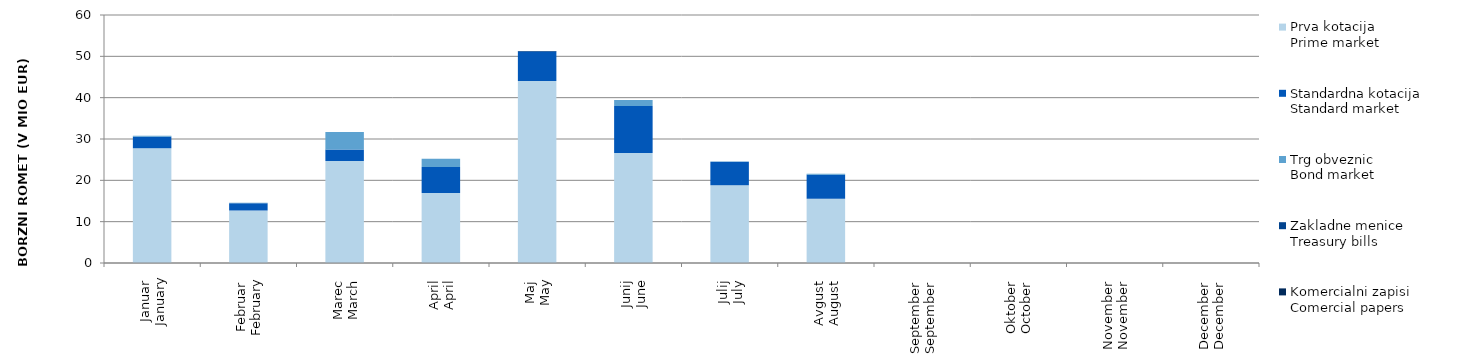
| Category | Prva kotacija
Prime market | Standardna kotacija
Standard market | Trg obveznic
Bond market | Zakladne menice
Treasury bills | Komercialni zapisi
Comercial papers |
|---|---|---|---|---|---|
| Januar
January | 27.745 | 2.796 | 0.249 | 0 | 0 |
| Februar
February | 12.685 | 1.784 | 0.118 | 0 | 0 |
| Marec
March | 24.676 | 2.813 | 4.174 | 0 | 0 |
| April
April | 16.942 | 6.272 | 2.01 | 0 | 0 |
| Maj
May | 44.02 | 7.1 | 0 | 0.145 | 0 |
| Junij
June | 26.612 | 11.39 | 1.425 | 0 | 0 |
| Julij
July | 18.826 | 5.646 | 0.075 | 0 | 0 |
| Avgust
August | 15.523 | 5.813 | 0.265 | 0 | 0 |
| September
September | 0 | 0 | 0 | 0 | 0 |
| Oktober
October | 0 | 0 | 0 | 0 | 0 |
| November
November | 0 | 0 | 0 | 0 | 0 |
| December
December | 0 | 0 | 0 | 0 | 0 |